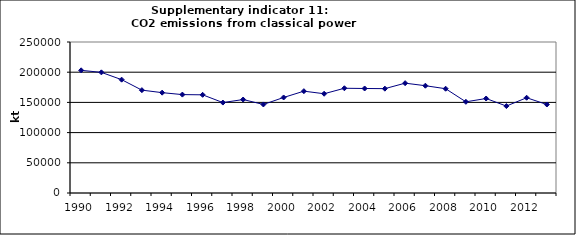
| Category | CO2 emissions from classical power production, kt |
|---|---|
| 1990 | 203096.274 |
| 1991 | 199711.115 |
| 1992 | 187675.945 |
| 1993 | 170303.531 |
| 1994 | 166147.273 |
| 1995 | 162910.562 |
| 1996 | 162561.482 |
| 1997 | 149729.396 |
| 1998 | 154727.475 |
| 1999 | 146577.06 |
| 2000 | 158154.425 |
| 2001 | 168602.77 |
| 2002 | 164339.586 |
| 2003 | 173423.533 |
| 2004 | 173034.52 |
| 2005 | 172767.539 |
| 2006 | 181835.019 |
| 2007 | 177640.53 |
| 2008 | 172626.516 |
| 2009 | 150948.042 |
| 2010 | 156447.75 |
| 2011 | 143929.225 |
| 2012 | 157720.367 |
| 2013 | 146519.626 |